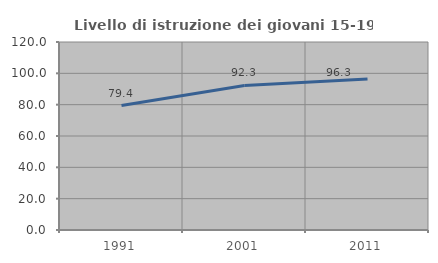
| Category | Livello di istruzione dei giovani 15-19 anni |
|---|---|
| 1991.0 | 79.425 |
| 2001.0 | 92.271 |
| 2011.0 | 96.346 |